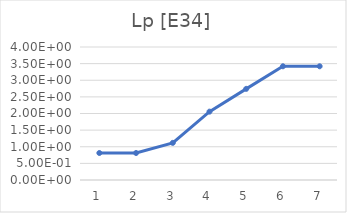
| Category | Lp [E34] |
|---|---|
| 0 | 0.812 |
| 1 | 0.812 |
| 2 | 1.117 |
| 3 | 2.056 |
| 4 | 2.741 |
| 5 | 3.42 |
| 6 | 3.42 |